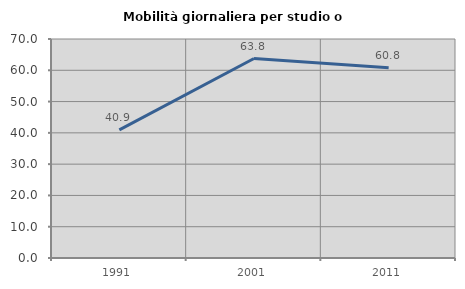
| Category | Mobilità giornaliera per studio o lavoro |
|---|---|
| 1991.0 | 40.941 |
| 2001.0 | 63.76 |
| 2011.0 | 60.843 |